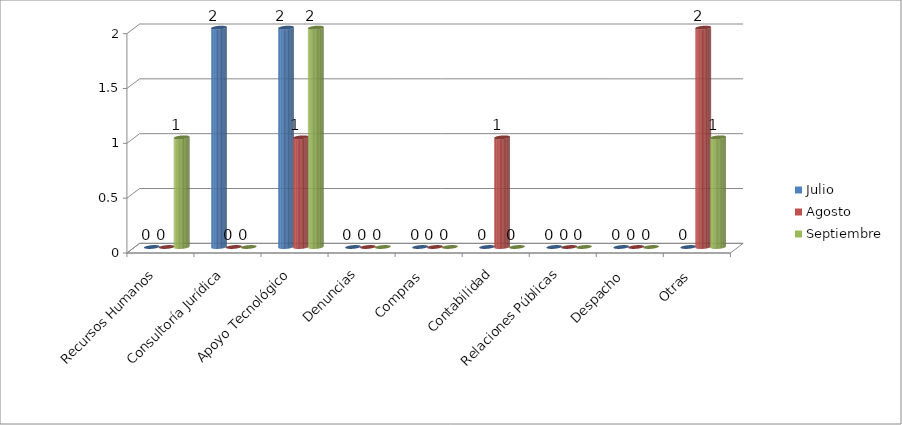
| Category | Julio | Agosto | Septiembre |
|---|---|---|---|
| Recursos Humanos | 0 | 0 | 1 |
| Consultoría Jurídica | 2 | 0 | 0 |
| Apoyo Tecnológico | 2 | 1 | 2 |
| Denuncias | 0 | 0 | 0 |
| Compras  | 0 | 0 | 0 |
| Contabilidad | 0 | 1 | 0 |
| Relaciones Públicas | 0 | 0 | 0 |
| Despacho  | 0 | 0 | 0 |
| Otras  | 0 | 2 | 1 |